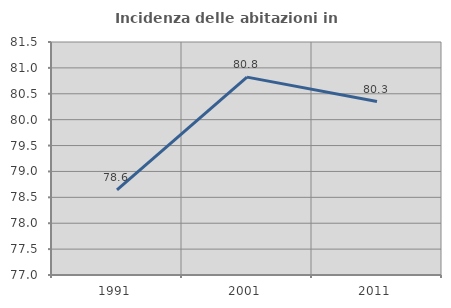
| Category | Incidenza delle abitazioni in proprietà  |
|---|---|
| 1991.0 | 78.646 |
| 2001.0 | 80.822 |
| 2011.0 | 80.349 |